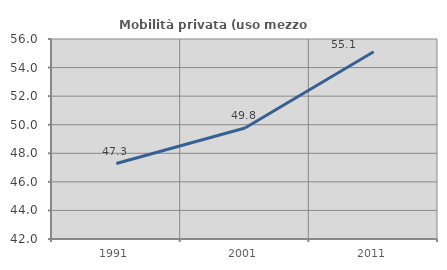
| Category | Mobilità privata (uso mezzo privato) |
|---|---|
| 1991.0 | 47.284 |
| 2001.0 | 49.771 |
| 2011.0 | 55.103 |